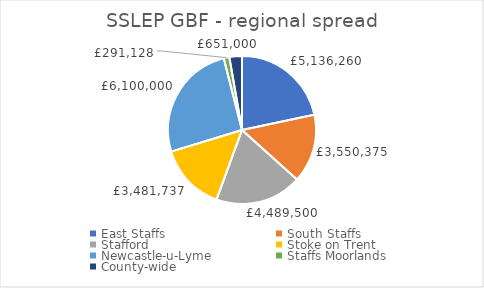
| Category | Series 0 |
|---|---|
| East Staffs | 5136260 |
| South Staffs | 3550375 |
| Stafford  | 4489500 |
| Stoke on Trent | 3481737 |
| Newcastle-u-Lyme | 6100000 |
| Staffs Moorlands | 291128 |
| County-wide | 651000 |